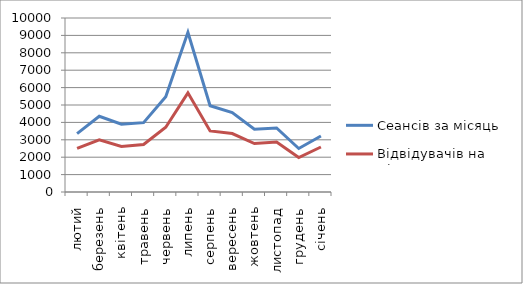
| Category | Сеансів за місяць | Відвідувачів на місяць |
|---|---|---|
| лютий | 3355 | 2504 |
| березень | 4350 | 3004 |
| квітень | 3894 | 2612 |
| травень | 3985 | 2733 |
| червень | 5476 | 3718 |
| липень | 9180 | 5698 |
| серпень | 4959 | 3510 |
| вересень | 4568 | 3360 |
| жовтень | 3604 | 2782 |
| листопад | 3678 | 2870 |
| грудень | 2499 | 1981 |
| січень | 3215 | 2587 |